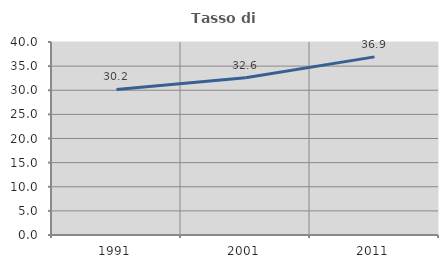
| Category | Tasso di occupazione   |
|---|---|
| 1991.0 | 30.177 |
| 2001.0 | 32.61 |
| 2011.0 | 36.915 |